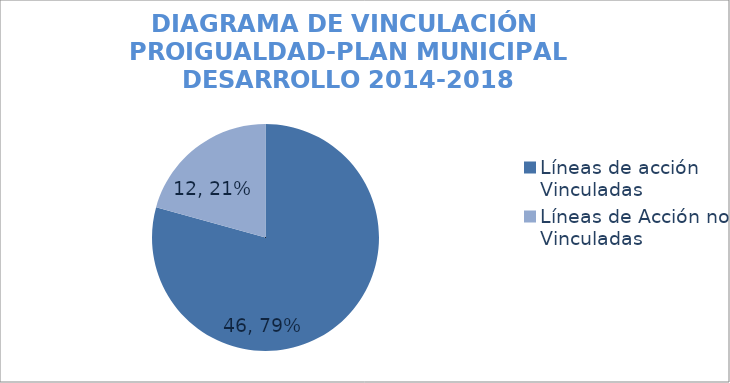
| Category | Series 0 |
|---|---|
| Líneas de acción Vinculadas | 46 |
| Líneas de Acción no Vinculadas | 12 |